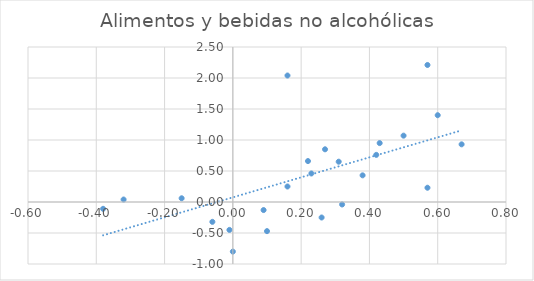
| Category | Alimentos y bebidas no alcohólicas |
|---|---|
| 0.38 | 0.43 |
| -0.15 | 0.06 |
| -0.06 | -0.32 |
| 0.32 | -0.04 |
| -0.01 | -0.45 |
| 0.0 | -0.8 |
| -0.38 | -0.11 |
| -0.32 | 0.04 |
| 0.16 | 2.04 |
| 0.57 | 2.21 |
| 0.67 | 0.93 |
| 0.42 | 0.76 |
| 0.26 | -0.25 |
| 0.1 | -0.47 |
| 0.16 | 0.25 |
| 0.23 | 0.46 |
| 0.09 | -0.13 |
| 0.22 | 0.66 |
| 0.27 | 0.85 |
| 0.31 | 0.65 |
| 0.5 | 1.07 |
| 0.43 | 0.95 |
| 0.57 | 0.23 |
| 0.6 | 1.4 |